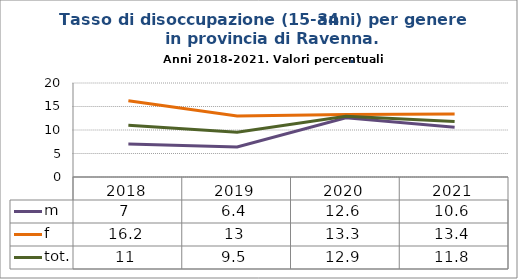
| Category | m | f | tot. |
|---|---|---|---|
| 2018.0 | 7 | 16.2 | 11 |
| 2019.0 | 6.4 | 13 | 9.5 |
| 2020.0 | 12.6 | 13.3 | 12.9 |
| 2021.0 | 10.6 | 13.4 | 11.8 |